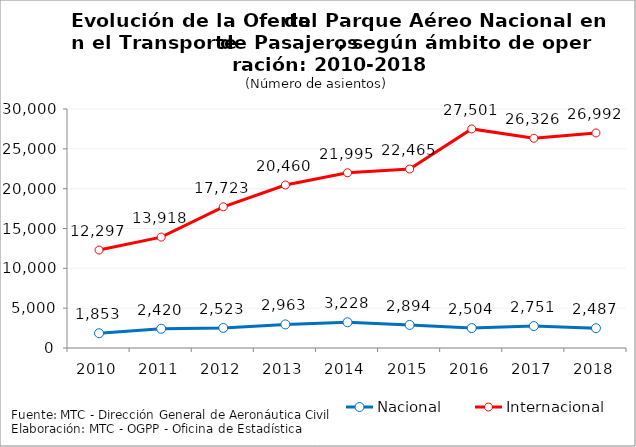
| Category | Nacional | Internacional |
|---|---|---|
| 2010.0 | 1853 | 12297 |
| 2011.0 | 2420 | 13918 |
| 2012.0 | 2523 | 17723 |
| 2013.0 | 2963 | 20460 |
| 2014.0 | 3228 | 21995 |
| 2015.0 | 2894 | 22465 |
| 2016.0 | 2504 | 27501 |
| 2017.0 | 2751 | 26326 |
| 2018.0 | 2487 | 26992 |